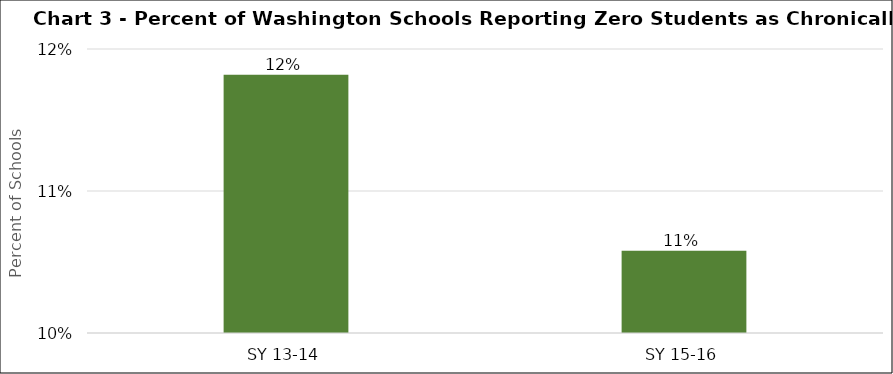
| Category | Series 0 |
|---|---|
| SY 13-14 | 0.118 |
| SY 15-16 | 0.106 |